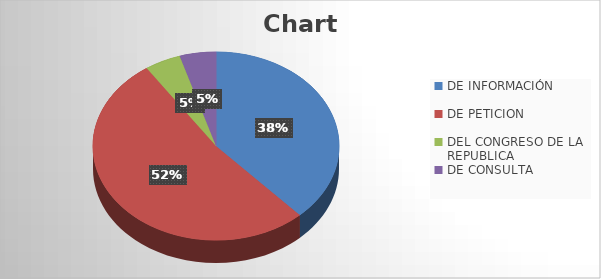
| Category | Series 0 |
|---|---|
| DE INFORMACIÓN | 8 |
| DE PETICION | 11 |
| DEL CONGRESO DE LA REPUBLICA | 1 |
| DE CONSULTA | 1 |